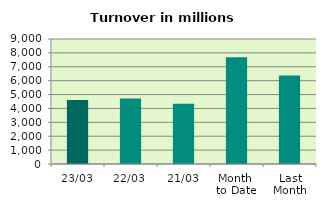
| Category | Series 0 |
|---|---|
| 23/03 | 4603.217 |
| 22/03 | 4709.535 |
| 21/03 | 4341.12 |
| Month 
to Date | 7686.714 |
| Last
Month | 6378.947 |